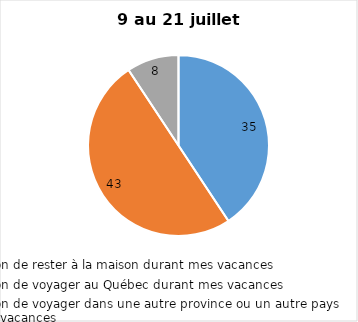
| Category | Series 0 |
|---|---|
| J’ai l’intention de rester à la maison durant mes vacances | 35 |
| J’ai l’intention de voyager au Québec durant mes vacances | 43 |
| J’ai l’intention de voyager dans une autre province ou un autre pays durant mes vacances | 8 |